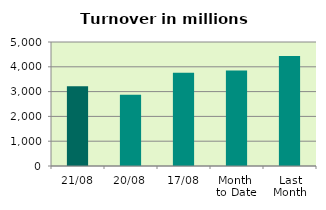
| Category | Series 0 |
|---|---|
| 21/08 | 3215.827 |
| 20/08 | 2876.192 |
| 17/08 | 3756.908 |
| Month 
to Date | 3855.081 |
| Last
Month | 4433.065 |